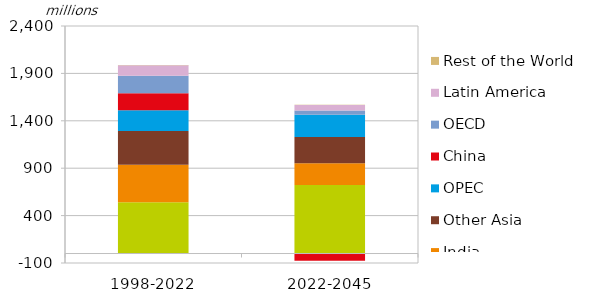
| Category | Middle East & Africa | India | Other Asia | OPEC | China | OECD | Latin America | Rest of the World |
|---|---|---|---|---|---|---|---|---|
| 1998-2022 | 540.663 | 395.739 | 355.042 | 220.376 | 179.051 | 183.859 | 111.471 | 1.592 |
| 2022-2045 | 722.944 | 228.69 | 276.608 | 234.366 | -76.13 | 45.574 | 59.205 | 1.182 |